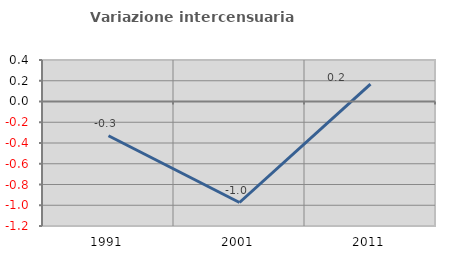
| Category | Variazione intercensuaria annua |
|---|---|
| 1991.0 | -0.33 |
| 2001.0 | -0.974 |
| 2011.0 | 0.167 |